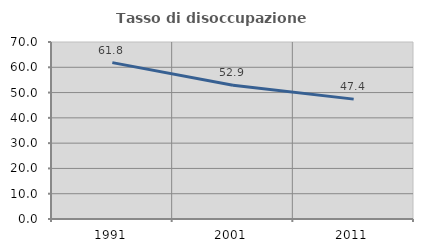
| Category | Tasso di disoccupazione giovanile  |
|---|---|
| 1991.0 | 61.844 |
| 2001.0 | 52.857 |
| 2011.0 | 47.41 |